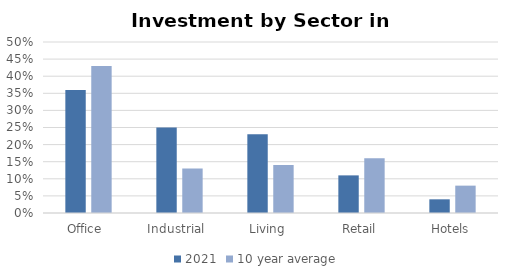
| Category | 2021 | 10 year average |
|---|---|---|
| Office  | 0.36 | 0.43 |
| Industrial  | 0.25 | 0.13 |
| Living  | 0.23 | 0.14 |
| Retail | 0.11 | 0.16 |
| Hotels | 0.04 | 0.08 |